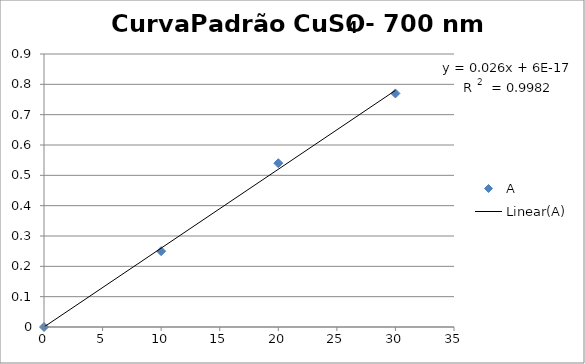
| Category | A |
|---|---|
| 0.0 | 0 |
| 10.0 | 0.25 |
| 20.0 | 0.54 |
| 30.0 | 0.77 |